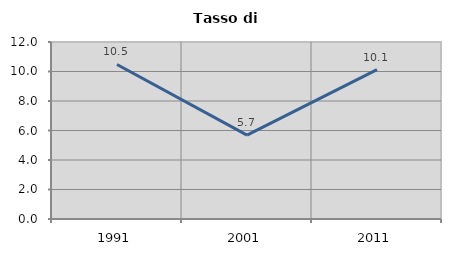
| Category | Tasso di disoccupazione   |
|---|---|
| 1991.0 | 10.477 |
| 2001.0 | 5.69 |
| 2011.0 | 10.128 |